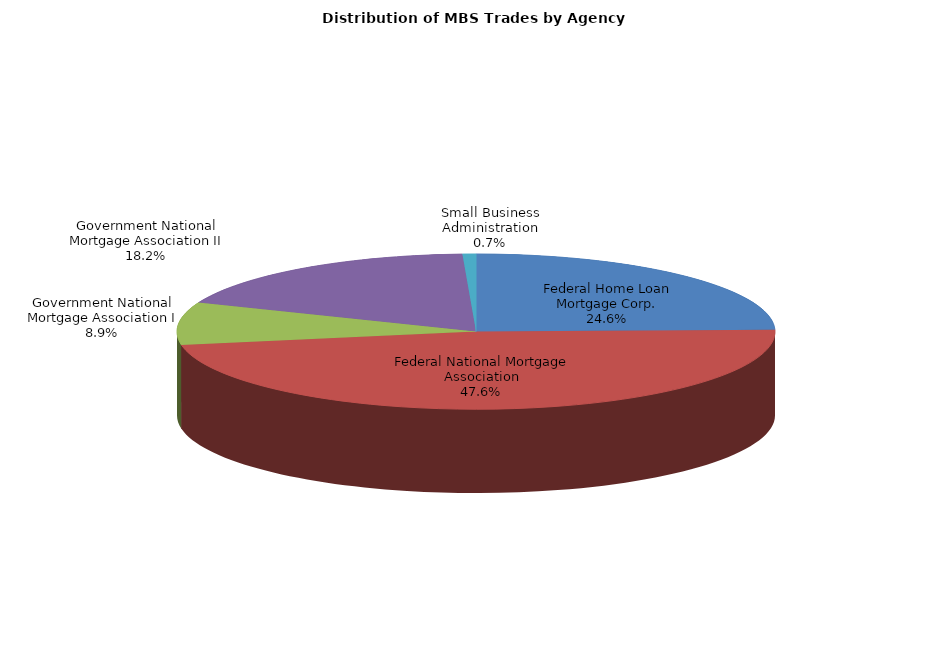
| Category | Series 0 |
|---|---|
| Federal Home Loan Mortgage Corp. | 797.179 |
| Federal National Mortgage Association | 1540.574 |
| Government National Mortgage Association I | 286.482 |
| Government National Mortgage Association II | 587.641 |
| Small Business Administration | 23.534 |